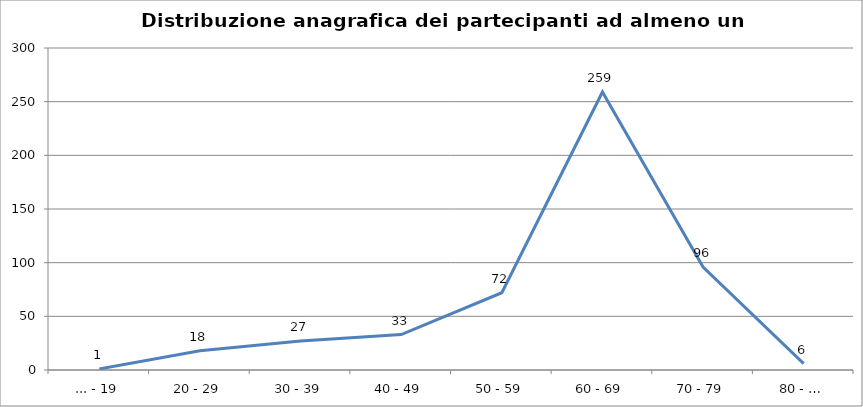
| Category | Nr. Tesserati |
|---|---|
| ... - 19 | 1 |
| 20 - 29 | 18 |
| 30 - 39 | 27 |
| 40 - 49 | 33 |
| 50 - 59 | 72 |
| 60 - 69 | 259 |
| 70 - 79 | 96 |
| 80 - … | 6 |